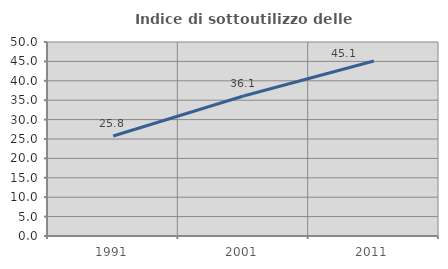
| Category | Indice di sottoutilizzo delle abitazioni  |
|---|---|
| 1991.0 | 25.761 |
| 2001.0 | 36.09 |
| 2011.0 | 45.11 |